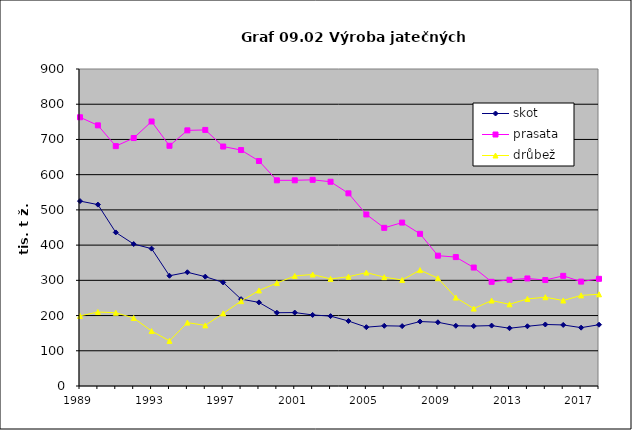
| Category | skot | prasata | drůbež |
|---|---|---|---|
| 1989.0 | 525 | 763 | 199 |
| 1990.0 | 515 | 740 | 210 |
| 1991.0 | 436 | 681 | 208 |
| 1992.0 | 403 | 704 | 193 |
| 1993.0 | 390 | 751 | 156 |
| 1994.0 | 313 | 682 | 128 |
| 1995.0 | 322.88 | 725.786 | 179.954 |
| 1996.0 | 310.426 | 727 | 172.064 |
| 1997.0 | 294 | 679.878 | 206.145 |
| 1998.0 | 246.585 | 669.905 | 240.887 |
| 1999.0 | 237.378 | 638.814 | 271.162 |
| 2000.0 | 208.04 | 583.929 | 292.289 |
| 2001.0 | 208.524 | 584.004 | 312.484 |
| 2002.0 | 201.744 | 585.374 | 316.582 |
| 2003.0 | 198.417 | 579.868 | 303.979 |
| 2004.0 | 184.531 | 547.009 | 310.225 |
| 2005.0 | 167 | 487 | 322 |
| 2006.0 | 171 | 449 | 309 |
| 2007.0 | 170 | 464 | 301 |
| 2008.0 | 183 | 432 | 329 |
| 2009.0 | 180.912 | 370 | 306 |
| 2010.0 | 171 | 366 | 251 |
| 2011.0 | 170.253 | 336.258 | 219.789 |
| 2012.0 | 171.426 | 295.791 | 242.568 |
| 2013.0 | 164.043 | 301.542 | 231.898 |
| 2014.0 | 169.588 | 305.306 | 247.215 |
| 2015.0 | 174.694 | 300.883 | 252.081 |
| 2016.0 | 173.342 | 312.739 | 242.624 |
| 2017.0 | 165.65 | 296.375 | 257.263 |
| 2018.0 | 173.982 | 304.356 | 260.375 |